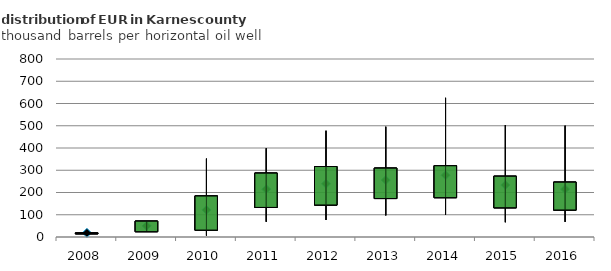
| Category | Mean |
|---|---|
| 2008.0 | 18.591 |
| 2009.0 | 50.018 |
| 2010.0 | 121.931 |
| 2011.0 | 214.901 |
| 2012.0 | 239.127 |
| 2013.0 | 255.877 |
| 2014.0 | 277.338 |
| 2015.0 | 233.616 |
| 2016.0 | 215.157 |